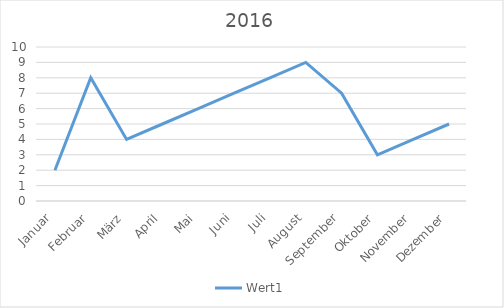
| Category | Wert1 |
|---|---|
| Januar | 2 |
| Februar | 8 |
| März | 4 |
| April | 5 |
| Mai | 6 |
| Juni | 7 |
| Juli | 8 |
| August | 9 |
| September | 7 |
| Oktober | 3 |
| November | 4 |
| Dezember | 5 |